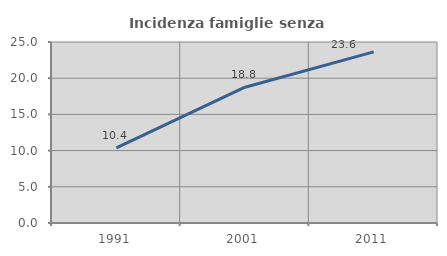
| Category | Incidenza famiglie senza nuclei |
|---|---|
| 1991.0 | 10.362 |
| 2001.0 | 18.757 |
| 2011.0 | 23.638 |